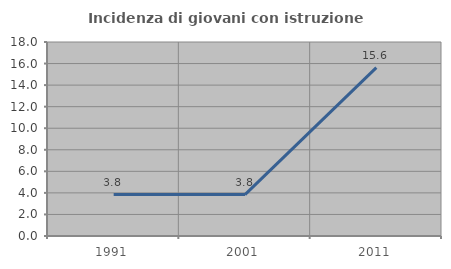
| Category | Incidenza di giovani con istruzione universitaria |
|---|---|
| 1991.0 | 3.846 |
| 2001.0 | 3.846 |
| 2011.0 | 15.625 |